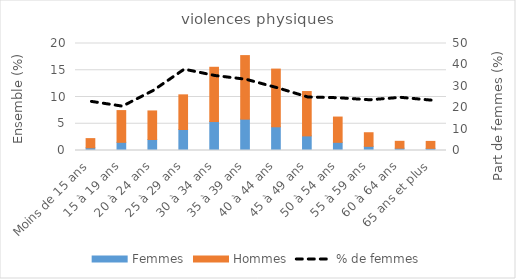
| Category | Femmes | Hommes |
|---|---|---|
| Moins de 15 ans | 0.504 | 1.717 |
| 15 à 19 ans | 1.529 | 5.932 |
| 20 à 24 ans | 2.06 | 5.335 |
| 25 à 29 ans | 3.93 | 6.473 |
| 30 à 34 ans | 5.414 | 10.141 |
| 35 à 39 ans | 5.863 | 11.876 |
| 40 à 44 ans | 4.434 | 10.783 |
| 45 à 49 ans | 2.731 | 8.29 |
| 50 à 54 ans | 1.526 | 4.725 |
| 55 à 59 ans | 0.779 | 2.541 |
| 60 à 64 ans | 0.423 | 1.294 |
| 65 ans et plus | 0.396 | 1.305 |